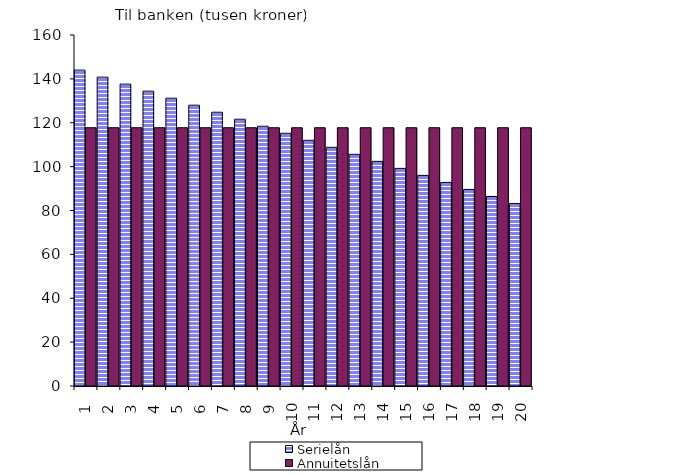
| Category | Serielån | Annuitetslån |
|---|---|---|
| 1.0 | 144 | 117.731 |
| 2.0 | 140.8 | 117.731 |
| 3.0 | 137.6 | 117.731 |
| 4.0 | 134.4 | 117.731 |
| 5.0 | 131.2 | 117.731 |
| 6.0 | 128 | 117.731 |
| 7.0 | 124.8 | 117.731 |
| 8.0 | 121.6 | 117.731 |
| 9.0 | 118.4 | 117.731 |
| 10.0 | 115.2 | 117.731 |
| 11.0 | 112 | 117.731 |
| 12.0 | 108.8 | 117.731 |
| 13.0 | 105.6 | 117.731 |
| 14.0 | 102.4 | 117.731 |
| 15.0 | 99.2 | 117.731 |
| 16.0 | 96 | 117.731 |
| 17.0 | 92.8 | 117.731 |
| 18.0 | 89.6 | 117.731 |
| 19.0 | 86.4 | 117.731 |
| 20.0 | 83.2 | 117.731 |